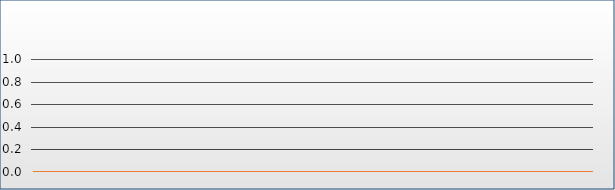
| Category | Mittelwert | Max | Min |
|---|---|---|---|
| 0 | 0 | 0 | 0 |
| 1/1/00 | 0 | 0 | 0 |
| 1/2/00 | 0 | 0 | 0 |
| 1/3/00 | 0 | 0 | 0 |
| 1/4/00 | 0 | 0 | 0 |
| 1/5/00 | 0 | 0 | 0 |
| 1/6/00 | 0 | 0 | 0 |
| 1/7/00 | 0 | 0 | 0 |
| 1/8/00 | 0 | 0 | 0 |
| 1/9/00 | 0 | 0 | 0 |
| 1/10/00 | 0 | 0 | 0 |
| 1/11/00 | 0 | 0 | 0 |
| 1/12/00 | 0 | 0 | 0 |
| 1/13/00 | 0 | 0 | 0 |
| 1/14/00 | 0 | 0 | 0 |
| 1/15/00 | 0 | 0 | 0 |
| 1/16/00 | 0 | 0 | 0 |
| 1/17/00 | 0 | 0 | 0 |
| 1/18/00 | 0 | 0 | 0 |
| 1/19/00 | 0 | 0 | 0 |
| 1/20/00 | 0 | 0 | 0 |
| 1/21/00 | 0 | 0 | 0 |
| 1/22/00 | 0 | 0 | 0 |
| 1/23/00 | 0 | 0 | 0 |
| 1/24/00 | 0 | 0 | 0 |
| 1/25/00 | 0 | 0 | 0 |
| 1/26/00 | 0 | 0 | 0 |
| 1/27/00 | 0 | 0 | 0 |
| 1/28/00 | 0 | 0 | 0 |
| 1/29/00 | 0 | 0 | 0 |
| 1/30/00 | 0 | 0 | 0 |
| 1/31/00 | 0 | 0 | 0 |
| 2/1/00 | 0 | 0 | 0 |
| 2/2/00 | 0 | 0 | 0 |
| 2/3/00 | 0 | 0 | 0 |
| 2/4/00 | 0 | 0 | 0 |
| 2/5/00 | 0 | 0 | 0 |
| 2/6/00 | 0 | 0 | 0 |
| 2/7/00 | 0 | 0 | 0 |
| 2/8/00 | 0 | 0 | 0 |
| 2/9/00 | 0 | 0 | 0 |
| 2/10/00 | 0 | 0 | 0 |
| 2/11/00 | 0 | 0 | 0 |
| 2/12/00 | 0 | 0 | 0 |
| 2/13/00 | 0 | 0 | 0 |
| 2/14/00 | 0 | 0 | 0 |
| 2/15/00 | 0 | 0 | 0 |
| 2/16/00 | 0 | 0 | 0 |
| 2/17/00 | 0 | 0 | 0 |
| 2/18/00 | 0 | 0 | 0 |
| 2/19/00 | 0 | 0 | 0 |
| 2/20/00 | 0 | 0 | 0 |
| 2/21/00 | 0 | 0 | 0 |
| 2/22/00 | 0 | 0 | 0 |
| 2/23/00 | 0 | 0 | 0 |
| 2/24/00 | 0 | 0 | 0 |
| 2/25/00 | 0 | 0 | 0 |
| 2/26/00 | 0 | 0 | 0 |
| 2/27/00 | 0 | 0 | 0 |
| 2/28/00 | 0 | 0 | 0 |
| 2/28/00 | 0 | 0 | 0 |
| 3/1/00 | 0 | 0 | 0 |
| 3/2/00 | 0 | 0 | 0 |
| 3/3/00 | 0 | 0 | 0 |
| 3/4/00 | 0 | 0 | 0 |
| 3/5/00 | 0 | 0 | 0 |
| 3/6/00 | 0 | 0 | 0 |
| 3/7/00 | 0 | 0 | 0 |
| 3/8/00 | 0 | 0 | 0 |
| 3/9/00 | 0 | 0 | 0 |
| 3/10/00 | 0 | 0 | 0 |
| 3/11/00 | 0 | 0 | 0 |
| 3/12/00 | 0 | 0 | 0 |
| 3/13/00 | 0 | 0 | 0 |
| 3/14/00 | 0 | 0 | 0 |
| 3/15/00 | 0 | 0 | 0 |
| 3/16/00 | 0 | 0 | 0 |
| 3/17/00 | 0 | 0 | 0 |
| 3/18/00 | 0 | 0 | 0 |
| 3/19/00 | 0 | 0 | 0 |
| 3/20/00 | 0 | 0 | 0 |
| 3/21/00 | 0 | 0 | 0 |
| 3/22/00 | 0 | 0 | 0 |
| 3/23/00 | 0 | 0 | 0 |
| 3/24/00 | 0 | 0 | 0 |
| 3/25/00 | 0 | 0 | 0 |
| 3/26/00 | 0 | 0 | 0 |
| 3/27/00 | 0 | 0 | 0 |
| 3/28/00 | 0 | 0 | 0 |
| 3/29/00 | 0 | 0 | 0 |
| 3/30/00 | 0 | 0 | 0 |
| 3/31/00 | 0 | 0 | 0 |
| 4/1/00 | 0 | 0 | 0 |
| 4/2/00 | 0 | 0 | 0 |
| 4/3/00 | 0 | 0 | 0 |
| 4/4/00 | 0 | 0 | 0 |
| 4/5/00 | 0 | 0 | 0 |
| 4/6/00 | 0 | 0 | 0 |
| 4/7/00 | 0 | 0 | 0 |
| 4/8/00 | 0 | 0 | 0 |
| 4/9/00 | 0 | 0 | 0 |
| 4/10/00 | 0 | 0 | 0 |
| 4/11/00 | 0 | 0 | 0 |
| 4/12/00 | 0 | 0 | 0 |
| 4/13/00 | 0 | 0 | 0 |
| 4/14/00 | 0 | 0 | 0 |
| 4/15/00 | 0 | 0 | 0 |
| 4/16/00 | 0 | 0 | 0 |
| 4/17/00 | 0 | 0 | 0 |
| 4/18/00 | 0 | 0 | 0 |
| 4/19/00 | 0 | 0 | 0 |
| 4/20/00 | 0 | 0 | 0 |
| 4/21/00 | 0 | 0 | 0 |
| 4/22/00 | 0 | 0 | 0 |
| 4/23/00 | 0 | 0 | 0 |
| 4/24/00 | 0 | 0 | 0 |
| 4/25/00 | 0 | 0 | 0 |
| 4/26/00 | 0 | 0 | 0 |
| 4/27/00 | 0 | 0 | 0 |
| 4/28/00 | 0 | 0 | 0 |
| 4/29/00 | 0 | 0 | 0 |
| 4/30/00 | 0 | 0 | 0 |
| 5/1/00 | 0 | 0 | 0 |
| 5/2/00 | 0 | 0 | 0 |
| 5/3/00 | 0 | 0 | 0 |
| 5/4/00 | 0 | 0 | 0 |
| 5/5/00 | 0 | 0 | 0 |
| 5/6/00 | 0 | 0 | 0 |
| 5/7/00 | 0 | 0 | 0 |
| 5/8/00 | 0 | 0 | 0 |
| 5/9/00 | 0 | 0 | 0 |
| 5/10/00 | 0 | 0 | 0 |
| 5/11/00 | 0 | 0 | 0 |
| 5/12/00 | 0 | 0 | 0 |
| 5/13/00 | 0 | 0 | 0 |
| 5/14/00 | 0 | 0 | 0 |
| 5/15/00 | 0 | 0 | 0 |
| 5/16/00 | 0 | 0 | 0 |
| 5/17/00 | 0 | 0 | 0 |
| 5/18/00 | 0 | 0 | 0 |
| 5/19/00 | 0 | 0 | 0 |
| 5/20/00 | 0 | 0 | 0 |
| 5/21/00 | 0 | 0 | 0 |
| 5/22/00 | 0 | 0 | 0 |
| 5/23/00 | 0 | 0 | 0 |
| 5/24/00 | 0 | 0 | 0 |
| 5/25/00 | 0 | 0 | 0 |
| 5/26/00 | 0 | 0 | 0 |
| 5/27/00 | 0 | 0 | 0 |
| 5/28/00 | 0 | 0 | 0 |
| 5/29/00 | 0 | 0 | 0 |
| 5/30/00 | 0 | 0 | 0 |
| 5/31/00 | 0 | 0 | 0 |
| 6/1/00 | 0 | 0 | 0 |
| 6/2/00 | 0 | 0 | 0 |
| 6/3/00 | 0 | 0 | 0 |
| 6/4/00 | 0 | 0 | 0 |
| 6/5/00 | 0 | 0 | 0 |
| 6/6/00 | 0 | 0 | 0 |
| 6/7/00 | 0 | 0 | 0 |
| 6/8/00 | 0 | 0 | 0 |
| 6/9/00 | 0 | 0 | 0 |
| 6/10/00 | 0 | 0 | 0 |
| 6/11/00 | 0 | 0 | 0 |
| 6/12/00 | 0 | 0 | 0 |
| 6/13/00 | 0 | 0 | 0 |
| 6/14/00 | 0 | 0 | 0 |
| 6/15/00 | 0 | 0 | 0 |
| 6/16/00 | 0 | 0 | 0 |
| 6/17/00 | 0 | 0 | 0 |
| 6/18/00 | 0 | 0 | 0 |
| 6/19/00 | 0 | 0 | 0 |
| 6/20/00 | 0 | 0 | 0 |
| 6/21/00 | 0 | 0 | 0 |
| 6/22/00 | 0 | 0 | 0 |
| 6/23/00 | 0 | 0 | 0 |
| 6/24/00 | 0 | 0 | 0 |
| 6/25/00 | 0 | 0 | 0 |
| 6/26/00 | 0 | 0 | 0 |
| 6/27/00 | 0 | 0 | 0 |
| 6/28/00 | 0 | 0 | 0 |
| 6/29/00 | 0 | 0 | 0 |
| 6/30/00 | 0 | 0 | 0 |
| 7/1/00 | 0 | 0 | 0 |
| 7/2/00 | 0 | 0 | 0 |
| 7/3/00 | 0 | 0 | 0 |
| 7/4/00 | 0 | 0 | 0 |
| 7/5/00 | 0 | 0 | 0 |
| 7/6/00 | 0 | 0 | 0 |
| 7/7/00 | 0 | 0 | 0 |
| 7/8/00 | 0 | 0 | 0 |
| 7/9/00 | 0 | 0 | 0 |
| 7/10/00 | 0 | 0 | 0 |
| 7/11/00 | 0 | 0 | 0 |
| 7/12/00 | 0 | 0 | 0 |
| 7/13/00 | 0 | 0 | 0 |
| 7/14/00 | 0 | 0 | 0 |
| 7/15/00 | 0 | 0 | 0 |
| 7/16/00 | 0 | 0 | 0 |
| 7/17/00 | 0 | 0 | 0 |
| 7/18/00 | 0 | 0 | 0 |
| 7/19/00 | 0 | 0 | 0 |
| 7/20/00 | 0 | 0 | 0 |
| 7/21/00 | 0 | 0 | 0 |
| 7/22/00 | 0 | 0 | 0 |
| 7/23/00 | 0 | 0 | 0 |
| 7/24/00 | 0 | 0 | 0 |
| 7/25/00 | 0 | 0 | 0 |
| 7/26/00 | 0 | 0 | 0 |
| 7/27/00 | 0 | 0 | 0 |
| 7/28/00 | 0 | 0 | 0 |
| 7/29/00 | 0 | 0 | 0 |
| 7/30/00 | 0 | 0 | 0 |
| 7/31/00 | 0 | 0 | 0 |
| 8/1/00 | 0 | 0 | 0 |
| 8/2/00 | 0 | 0 | 0 |
| 8/3/00 | 0 | 0 | 0 |
| 8/4/00 | 0 | 0 | 0 |
| 8/5/00 | 0 | 0 | 0 |
| 8/6/00 | 0 | 0 | 0 |
| 8/7/00 | 0 | 0 | 0 |
| 8/8/00 | 0 | 0 | 0 |
| 8/9/00 | 0 | 0 | 0 |
| 8/10/00 | 0 | 0 | 0 |
| 8/11/00 | 0 | 0 | 0 |
| 8/12/00 | 0 | 0 | 0 |
| 8/13/00 | 0 | 0 | 0 |
| 8/14/00 | 0 | 0 | 0 |
| 8/15/00 | 0 | 0 | 0 |
| 8/16/00 | 0 | 0 | 0 |
| 8/17/00 | 0 | 0 | 0 |
| 8/18/00 | 0 | 0 | 0 |
| 8/19/00 | 0 | 0 | 0 |
| 8/20/00 | 0 | 0 | 0 |
| 8/21/00 | 0 | 0 | 0 |
| 8/22/00 | 0 | 0 | 0 |
| 8/23/00 | 0 | 0 | 0 |
| 8/24/00 | 0 | 0 | 0 |
| 8/25/00 | 0 | 0 | 0 |
| 8/26/00 | 0 | 0 | 0 |
| 8/27/00 | 0 | 0 | 0 |
| 8/28/00 | 0 | 0 | 0 |
| 8/29/00 | 0 | 0 | 0 |
| 8/30/00 | 0 | 0 | 0 |
| 8/31/00 | 0 | 0 | 0 |
| 9/1/00 | 0 | 0 | 0 |
| 9/2/00 | 0 | 0 | 0 |
| 9/3/00 | 0 | 0 | 0 |
| 9/4/00 | 0 | 0 | 0 |
| 9/5/00 | 0 | 0 | 0 |
| 9/6/00 | 0 | 0 | 0 |
| 9/7/00 | 0 | 0 | 0 |
| 9/8/00 | 0 | 0 | 0 |
| 9/9/00 | 0 | 0 | 0 |
| 9/10/00 | 0 | 0 | 0 |
| 9/11/00 | 0 | 0 | 0 |
| 9/12/00 | 0 | 0 | 0 |
| 9/13/00 | 0 | 0 | 0 |
| 9/14/00 | 0 | 0 | 0 |
| 9/15/00 | 0 | 0 | 0 |
| 9/16/00 | 0 | 0 | 0 |
| 9/17/00 | 0 | 0 | 0 |
| 9/18/00 | 0 | 0 | 0 |
| 9/19/00 | 0 | 0 | 0 |
| 9/20/00 | 0 | 0 | 0 |
| 9/21/00 | 0 | 0 | 0 |
| 9/22/00 | 0 | 0 | 0 |
| 9/23/00 | 0 | 0 | 0 |
| 9/24/00 | 0 | 0 | 0 |
| 9/25/00 | 0 | 0 | 0 |
| 9/26/00 | 0 | 0 | 0 |
| 9/27/00 | 0 | 0 | 0 |
| 9/28/00 | 0 | 0 | 0 |
| 9/29/00 | 0 | 0 | 0 |
| 9/30/00 | 0 | 0 | 0 |
| 10/1/00 | 0 | 0 | 0 |
| 10/2/00 | 0 | 0 | 0 |
| 10/3/00 | 0 | 0 | 0 |
| 10/4/00 | 0 | 0 | 0 |
| 10/5/00 | 0 | 0 | 0 |
| 10/6/00 | 0 | 0 | 0 |
| 10/7/00 | 0 | 0 | 0 |
| 10/8/00 | 0 | 0 | 0 |
| 10/9/00 | 0 | 0 | 0 |
| 10/10/00 | 0 | 0 | 0 |
| 10/11/00 | 0 | 0 | 0 |
| 10/12/00 | 0 | 0 | 0 |
| 10/13/00 | 0 | 0 | 0 |
| 10/14/00 | 0 | 0 | 0 |
| 10/15/00 | 0 | 0 | 0 |
| 10/16/00 | 0 | 0 | 0 |
| 10/17/00 | 0 | 0 | 0 |
| 10/18/00 | 0 | 0 | 0 |
| 10/19/00 | 0 | 0 | 0 |
| 10/20/00 | 0 | 0 | 0 |
| 10/21/00 | 0 | 0 | 0 |
| 10/22/00 | 0 | 0 | 0 |
| 10/23/00 | 0 | 0 | 0 |
| 10/24/00 | 0 | 0 | 0 |
| 10/25/00 | 0 | 0 | 0 |